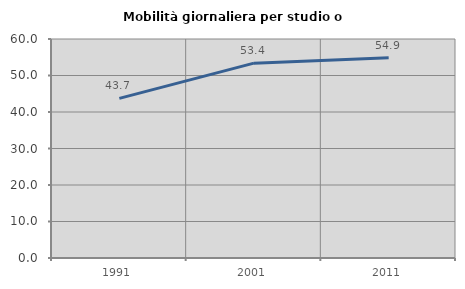
| Category | Mobilità giornaliera per studio o lavoro |
|---|---|
| 1991.0 | 43.723 |
| 2001.0 | 53.382 |
| 2011.0 | 54.868 |